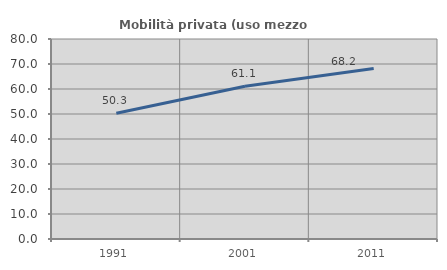
| Category | Mobilità privata (uso mezzo privato) |
|---|---|
| 1991.0 | 50.296 |
| 2001.0 | 61.095 |
| 2011.0 | 68.219 |